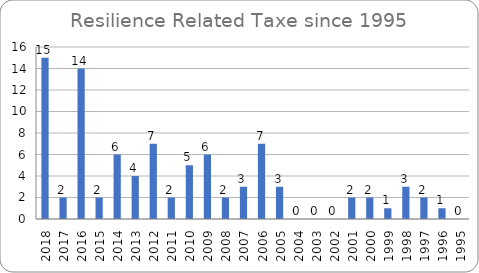
| Category | Series 0 |
|---|---|
| 2018.0 | 15 |
| 2017.0 | 2 |
| 2016.0 | 14 |
| 2015.0 | 2 |
| 2014.0 | 6 |
| 2013.0 | 4 |
| 2012.0 | 7 |
| 2011.0 | 2 |
| 2010.0 | 5 |
| 2009.0 | 6 |
| 2008.0 | 2 |
| 2007.0 | 3 |
| 2006.0 | 7 |
| 2005.0 | 3 |
| 2004.0 | 0 |
| 2003.0 | 0 |
| 2002.0 | 0 |
| 2001.0 | 2 |
| 2000.0 | 2 |
| 1999.0 | 1 |
| 1998.0 | 3 |
| 1997.0 | 2 |
| 1996.0 | 1 |
| 1995.0 | 0 |